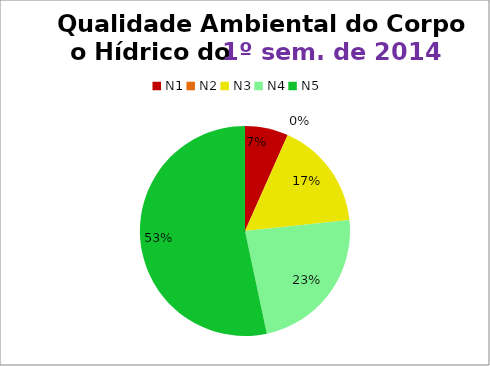
| Category | 1º/14 |
|---|---|
| N1 | 2 |
| N2 | 0 |
| N3 | 5 |
| N4 | 7 |
| N5 | 16 |